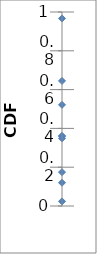
| Category | 0.5 |
|---|---|
| 0.0 | 0.521 |
| 0.0 | 0.349 |
| 0.0 | 0.645 |
| 0.0 | 0.362 |
| 0.0 | 0.967 |
| 0.0 | 0.36 |
| 0.0 | 0.024 |
| 0.0 | 0.12 |
| 0.0 | 0.174 |